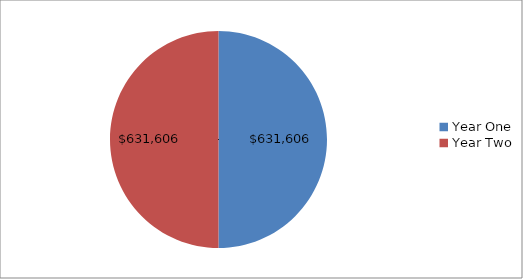
| Category | Series 0 |
|---|---|
| Year One | 631606 |
| Year Two | 631606 |